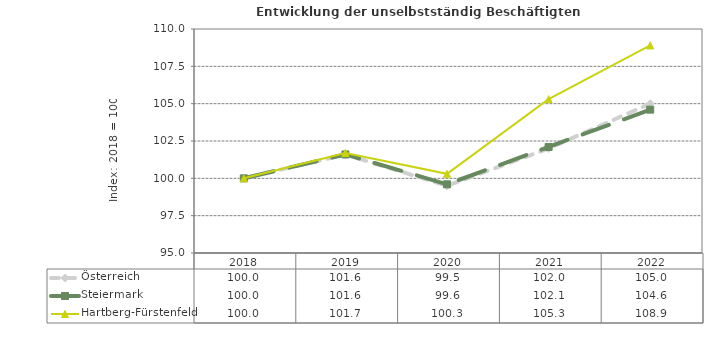
| Category | Österreich | Steiermark | Hartberg-Fürstenfeld |
|---|---|---|---|
| 2022.0 | 105 | 104.6 | 108.9 |
| 2021.0 | 102 | 102.1 | 105.3 |
| 2020.0 | 99.5 | 99.6 | 100.3 |
| 2019.0 | 101.6 | 101.6 | 101.7 |
| 2018.0 | 100 | 100 | 100 |